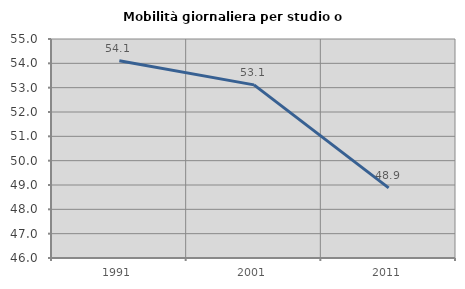
| Category | Mobilità giornaliera per studio o lavoro |
|---|---|
| 1991.0 | 54.103 |
| 2001.0 | 53.115 |
| 2011.0 | 48.881 |